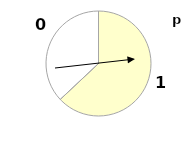
| Category | Series 0 |
|---|---|
| 1.0 | 0.63 |
| 0.0 | 0.37 |